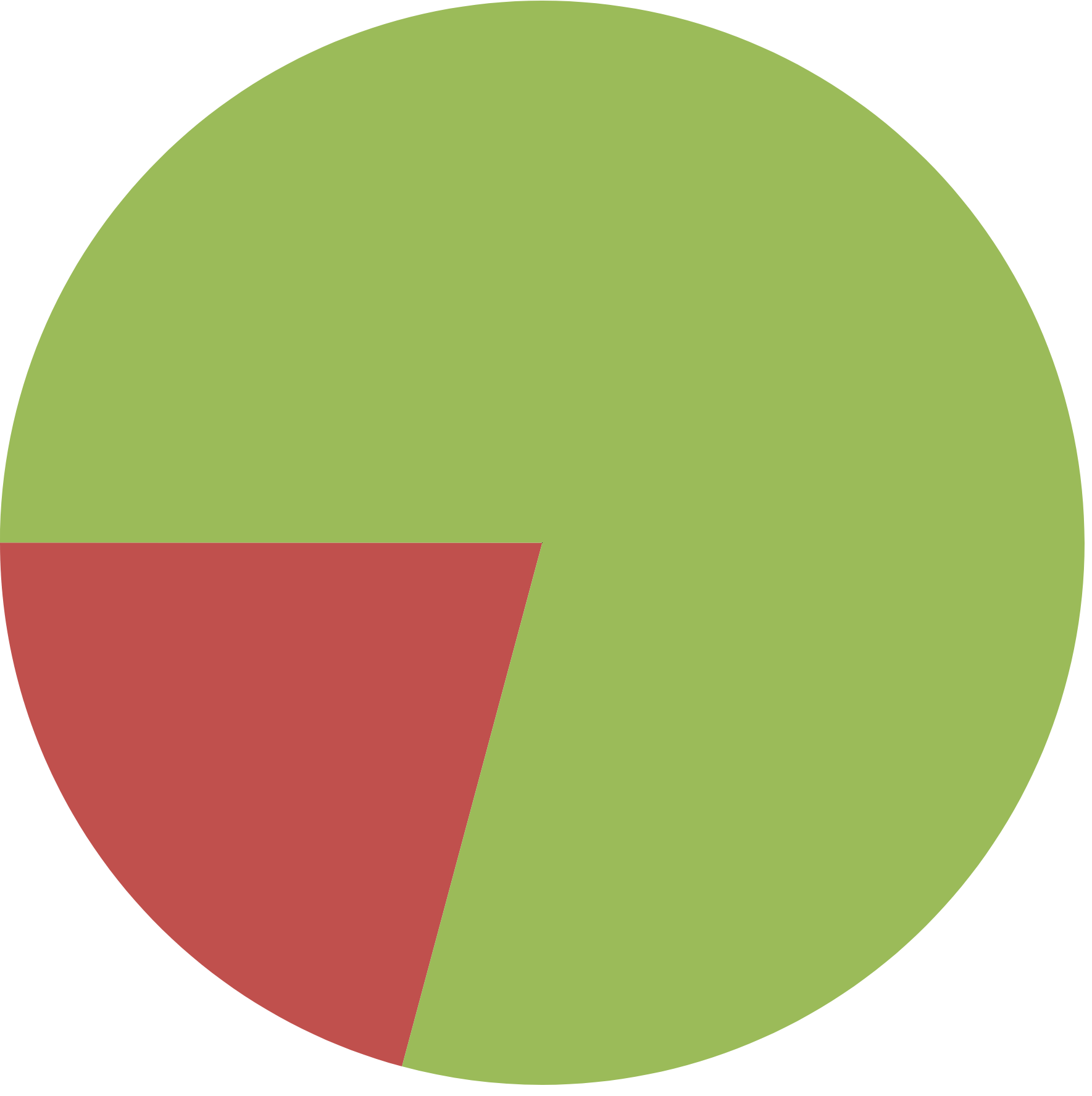
| Category | Series 0 |
|---|---|
| GHGs from LNG and associated extraction/processing | 0 |
| GHGs from non-LNG extration/processing | 13.285 |
| GHGs from the rest of B.C.'s economy | 50.47 |